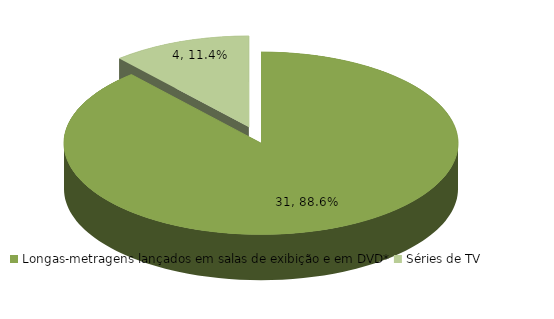
| Category | Series 0 |
|---|---|
| Longas-metragens lançados em salas de exibição e em DVD* | 31 |
| Séries de TV | 4 |